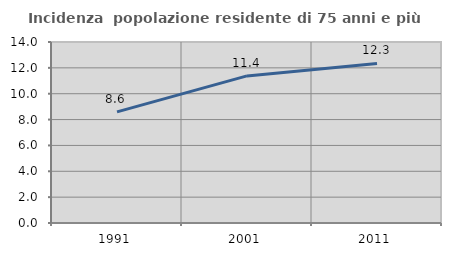
| Category | Incidenza  popolazione residente di 75 anni e più |
|---|---|
| 1991.0 | 8.594 |
| 2001.0 | 11.379 |
| 2011.0 | 12.344 |